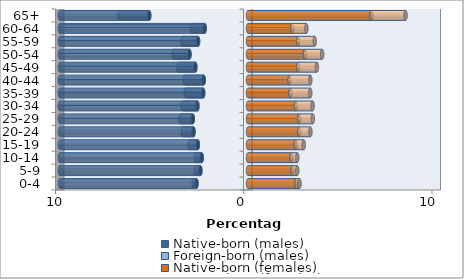
| Category | Native-born (males) | Foreign-born (males) | Native-born (females) | Foreign-born (females) |
|---|---|---|---|---|
| 0-4 | -2.735 | -0.152 | 2.579 | 0.16 |
| 5-9 | -2.528 | -0.235 | 2.376 | 0.24 |
| 10-14 | -2.459 | -0.307 | 2.314 | 0.303 |
| 15-19 | -2.665 | -0.432 | 2.536 | 0.428 |
| 20-24 | -2.894 | -0.574 | 2.717 | 0.6 |
| 25-29 | -2.932 | -0.647 | 2.723 | 0.722 |
| 30-34 | -2.687 | -0.774 | 2.545 | 0.887 |
| 35-39 | -2.38 | -0.928 | 2.264 | 1.046 |
| 40-44 | -2.352 | -1.002 | 2.213 | 1.1 |
| 45-49 | -2.797 | -0.916 | 2.671 | 0.992 |
| 50-54 | -3.108 | -0.844 | 3.033 | 0.905 |
| 55-59 | -2.651 | -0.824 | 2.663 | 0.884 |
| 60-64 | -2.3 | -0.671 | 2.362 | 0.741 |
| 65+ | -5.247 | -1.583 | 6.565 | 1.806 |